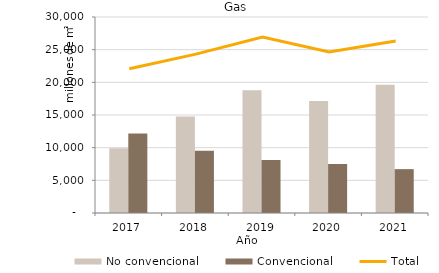
| Category | No convencional | Convencional |
|---|---|---|
| 2017.0 | 9926.667 | 12150.411 |
| 2018.0 | 14777.135 | 9539.213 |
| 2019.0 | 18797.502 | 8117.756 |
| 2020.0 | 17149.549 | 7496.214 |
| 2021.0 | 19618.796 | 6715.368 |